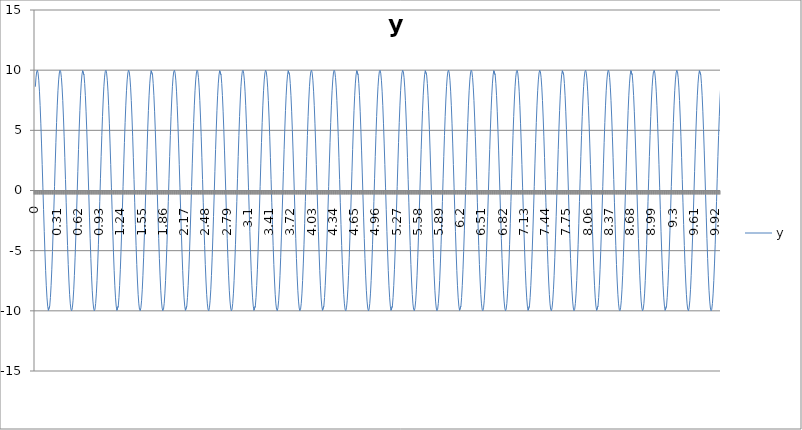
| Category | y |
|---|---|
| 0.0 | 8.623 |
| 0.01 | 9.419 |
| 0.02 | 9.882 |
| 0.03 | 9.994 |
| 0.04 | 9.752 |
| 0.05 | 9.165 |
| 0.060000000000000005 | 8.253 |
| 0.07 | 7.049 |
| 0.08 | 5.595 |
| 0.09 | 3.943 |
| 0.09999999999999999 | 2.151 |
| 0.10999999999999999 | 0.283 |
| 0.11999999999999998 | -1.595 |
| 0.12999999999999998 | -3.417 |
| 0.13999999999999999 | -5.117 |
| 0.15 | -6.636 |
| 0.16 | -7.921 |
| 0.17 | -8.924 |
| 0.18000000000000002 | -9.612 |
| 0.19000000000000003 | -9.958 |
| 0.20000000000000004 | -9.953 |
| 0.21000000000000005 | -9.594 |
| 0.22000000000000006 | -8.896 |
| 0.23000000000000007 | -7.882 |
| 0.24000000000000007 | -6.59 |
| 0.25000000000000006 | -5.064 |
| 0.26000000000000006 | -3.358 |
| 0.2700000000000001 | -1.534 |
| 0.2800000000000001 | 0.345 |
| 0.2900000000000001 | 2.212 |
| 0.3000000000000001 | 4 |
| 0.3100000000000001 | 5.646 |
| 0.3200000000000001 | 7.093 |
| 0.3300000000000001 | 8.288 |
| 0.34000000000000014 | 9.19 |
| 0.35000000000000014 | 9.766 |
| 0.36000000000000015 | 9.996 |
| 0.37000000000000016 | 9.872 |
| 0.38000000000000017 | 9.398 |
| 0.3900000000000002 | 8.592 |
| 0.4000000000000002 | 7.481 |
| 0.4100000000000002 | 6.105 |
| 0.4200000000000002 | 4.512 |
| 0.4300000000000002 | 2.76 |
| 0.4400000000000002 | 0.91 |
| 0.45000000000000023 | -0.972 |
| 0.46000000000000024 | -2.82 |
| 0.47000000000000025 | -4.568 |
| 0.48000000000000026 | -6.154 |
| 0.49000000000000027 | -7.522 |
| 0.5000000000000002 | -8.623 |
| 0.5100000000000002 | -9.419 |
| 0.5200000000000002 | -9.882 |
| 0.5300000000000002 | -9.994 |
| 0.5400000000000003 | -9.752 |
| 0.5500000000000003 | -9.165 |
| 0.5600000000000003 | -8.253 |
| 0.5700000000000003 | -7.049 |
| 0.5800000000000003 | -5.595 |
| 0.5900000000000003 | -3.943 |
| 0.6000000000000003 | -2.151 |
| 0.6100000000000003 | -0.283 |
| 0.6200000000000003 | 1.595 |
| 0.6300000000000003 | 3.417 |
| 0.6400000000000003 | 5.117 |
| 0.6500000000000004 | 6.636 |
| 0.6600000000000004 | 7.921 |
| 0.6700000000000004 | 8.924 |
| 0.6800000000000004 | 9.612 |
| 0.6900000000000004 | 9.958 |
| 0.7000000000000004 | 9.953 |
| 0.7100000000000004 | 9.594 |
| 0.7200000000000004 | 8.896 |
| 0.7300000000000004 | 7.882 |
| 0.7400000000000004 | 6.59 |
| 0.7500000000000004 | 5.064 |
| 0.7600000000000005 | 3.358 |
| 0.7700000000000005 | 1.534 |
| 0.7800000000000005 | -0.345 |
| 0.7900000000000005 | -2.212 |
| 0.8000000000000005 | -4 |
| 0.8100000000000005 | -5.646 |
| 0.8200000000000005 | -7.093 |
| 0.8300000000000005 | -8.288 |
| 0.8400000000000005 | -9.19 |
| 0.8500000000000005 | -9.766 |
| 0.8600000000000005 | -9.996 |
| 0.8700000000000006 | -9.872 |
| 0.8800000000000006 | -9.398 |
| 0.8900000000000006 | -8.592 |
| 0.9000000000000006 | -7.481 |
| 0.9100000000000006 | -6.105 |
| 0.9200000000000006 | -4.512 |
| 0.9300000000000006 | -2.76 |
| 0.9400000000000006 | -0.91 |
| 0.9500000000000006 | 0.972 |
| 0.9600000000000006 | 2.82 |
| 0.9700000000000006 | 4.568 |
| 0.9800000000000006 | 6.154 |
| 0.9900000000000007 | 7.522 |
| 1.0000000000000007 | 8.623 |
| 1.0100000000000007 | 9.419 |
| 1.0200000000000007 | 9.882 |
| 1.0300000000000007 | 9.994 |
| 1.0400000000000007 | 9.752 |
| 1.0500000000000007 | 9.165 |
| 1.0600000000000007 | 8.253 |
| 1.0700000000000007 | 7.049 |
| 1.0800000000000007 | 5.595 |
| 1.0900000000000007 | 3.943 |
| 1.1000000000000008 | 2.151 |
| 1.1100000000000008 | 0.283 |
| 1.1200000000000008 | -1.595 |
| 1.1300000000000008 | -3.417 |
| 1.1400000000000008 | -5.117 |
| 1.1500000000000008 | -6.636 |
| 1.1600000000000008 | -7.921 |
| 1.1700000000000008 | -8.924 |
| 1.1800000000000008 | -9.612 |
| 1.1900000000000008 | -9.958 |
| 1.2000000000000008 | -9.953 |
| 1.2100000000000009 | -9.594 |
| 1.2200000000000009 | -8.896 |
| 1.2300000000000009 | -7.882 |
| 1.2400000000000009 | -6.59 |
| 1.2500000000000009 | -5.064 |
| 1.260000000000001 | -3.358 |
| 1.270000000000001 | -1.534 |
| 1.280000000000001 | 0.345 |
| 1.290000000000001 | 2.212 |
| 1.300000000000001 | 4 |
| 1.310000000000001 | 5.646 |
| 1.320000000000001 | 7.093 |
| 1.330000000000001 | 8.288 |
| 1.340000000000001 | 9.19 |
| 1.350000000000001 | 9.766 |
| 1.360000000000001 | 9.996 |
| 1.370000000000001 | 9.872 |
| 1.380000000000001 | 9.398 |
| 1.390000000000001 | 8.592 |
| 1.400000000000001 | 7.481 |
| 1.410000000000001 | 6.105 |
| 1.420000000000001 | 4.512 |
| 1.430000000000001 | 2.76 |
| 1.440000000000001 | 0.91 |
| 1.450000000000001 | -0.972 |
| 1.460000000000001 | -2.82 |
| 1.470000000000001 | -4.568 |
| 1.480000000000001 | -6.154 |
| 1.490000000000001 | -7.522 |
| 1.500000000000001 | -8.623 |
| 1.5100000000000011 | -9.419 |
| 1.5200000000000011 | -9.882 |
| 1.5300000000000011 | -9.994 |
| 1.5400000000000011 | -9.752 |
| 1.5500000000000012 | -9.165 |
| 1.5600000000000012 | -8.253 |
| 1.5700000000000012 | -7.049 |
| 1.5800000000000012 | -5.595 |
| 1.5900000000000012 | -3.943 |
| 1.6000000000000012 | -2.151 |
| 1.6100000000000012 | -0.283 |
| 1.6200000000000012 | 1.595 |
| 1.6300000000000012 | 3.417 |
| 1.6400000000000012 | 5.117 |
| 1.6500000000000012 | 6.636 |
| 1.6600000000000013 | 7.921 |
| 1.6700000000000013 | 8.924 |
| 1.6800000000000013 | 9.612 |
| 1.6900000000000013 | 9.958 |
| 1.7000000000000013 | 9.953 |
| 1.7100000000000013 | 9.594 |
| 1.7200000000000013 | 8.896 |
| 1.7300000000000013 | 7.882 |
| 1.7400000000000013 | 6.59 |
| 1.7500000000000013 | 5.064 |
| 1.7600000000000013 | 3.358 |
| 1.7700000000000014 | 1.534 |
| 1.7800000000000014 | -0.345 |
| 1.7900000000000014 | -2.212 |
| 1.8000000000000014 | -4 |
| 1.8100000000000014 | -5.646 |
| 1.8200000000000014 | -7.093 |
| 1.8300000000000014 | -8.288 |
| 1.8400000000000014 | -9.19 |
| 1.8500000000000014 | -9.766 |
| 1.8600000000000014 | -9.996 |
| 1.8700000000000014 | -9.872 |
| 1.8800000000000014 | -9.398 |
| 1.8900000000000015 | -8.592 |
| 1.9000000000000015 | -7.481 |
| 1.9100000000000015 | -6.105 |
| 1.9200000000000015 | -4.512 |
| 1.9300000000000015 | -2.76 |
| 1.9400000000000015 | -0.91 |
| 1.9500000000000015 | 0.972 |
| 1.9600000000000015 | 2.82 |
| 1.9700000000000015 | 4.568 |
| 1.9800000000000015 | 6.154 |
| 1.9900000000000015 | 7.522 |
| 2.0000000000000013 | 8.623 |
| 2.010000000000001 | 9.419 |
| 2.020000000000001 | 9.882 |
| 2.0300000000000007 | 9.994 |
| 2.0400000000000005 | 9.752 |
| 2.0500000000000003 | 9.165 |
| 2.06 | 8.253 |
| 2.07 | 7.049 |
| 2.0799999999999996 | 5.595 |
| 2.0899999999999994 | 3.943 |
| 2.099999999999999 | 2.151 |
| 2.109999999999999 | 0.283 |
| 2.1199999999999988 | -1.595 |
| 2.1299999999999986 | -3.417 |
| 2.1399999999999983 | -5.117 |
| 2.149999999999998 | -6.636 |
| 2.159999999999998 | -7.921 |
| 2.1699999999999977 | -8.924 |
| 2.1799999999999975 | -9.612 |
| 2.1899999999999973 | -9.958 |
| 2.199999999999997 | -9.953 |
| 2.209999999999997 | -9.594 |
| 2.2199999999999966 | -8.896 |
| 2.2299999999999964 | -7.882 |
| 2.239999999999996 | -6.59 |
| 2.249999999999996 | -5.064 |
| 2.259999999999996 | -3.358 |
| 2.2699999999999956 | -1.534 |
| 2.2799999999999954 | 0.345 |
| 2.289999999999995 | 2.212 |
| 2.299999999999995 | 4 |
| 2.3099999999999947 | 5.646 |
| 2.3199999999999945 | 7.093 |
| 2.3299999999999943 | 8.288 |
| 2.339999999999994 | 9.19 |
| 2.349999999999994 | 9.766 |
| 2.3599999999999937 | 9.996 |
| 2.3699999999999934 | 9.872 |
| 2.3799999999999932 | 9.398 |
| 2.389999999999993 | 8.592 |
| 2.399999999999993 | 7.481 |
| 2.4099999999999926 | 6.105 |
| 2.4199999999999924 | 4.512 |
| 2.429999999999992 | 2.76 |
| 2.439999999999992 | 0.91 |
| 2.4499999999999917 | -0.972 |
| 2.4599999999999915 | -2.82 |
| 2.4699999999999913 | -4.568 |
| 2.479999999999991 | -6.154 |
| 2.489999999999991 | -7.522 |
| 2.4999999999999907 | -8.623 |
| 2.5099999999999905 | -9.419 |
| 2.5199999999999902 | -9.882 |
| 2.52999999999999 | -9.994 |
| 2.53999999999999 | -9.752 |
| 2.5499999999999896 | -9.165 |
| 2.5599999999999894 | -8.253 |
| 2.569999999999989 | -7.049 |
| 2.579999999999989 | -5.595 |
| 2.5899999999999888 | -3.943 |
| 2.5999999999999885 | -2.151 |
| 2.6099999999999883 | -0.283 |
| 2.619999999999988 | 1.595 |
| 2.629999999999988 | 3.417 |
| 2.6399999999999877 | 5.117 |
| 2.6499999999999875 | 6.636 |
| 2.6599999999999873 | 7.921 |
| 2.669999999999987 | 8.924 |
| 2.679999999999987 | 9.612 |
| 2.6899999999999866 | 9.958 |
| 2.6999999999999864 | 9.953 |
| 2.709999999999986 | 9.594 |
| 2.719999999999986 | 8.896 |
| 2.7299999999999858 | 7.882 |
| 2.7399999999999856 | 6.59 |
| 2.7499999999999853 | 5.064 |
| 2.759999999999985 | 3.358 |
| 2.769999999999985 | 1.534 |
| 2.7799999999999847 | -0.345 |
| 2.7899999999999845 | -2.212 |
| 2.7999999999999843 | -4 |
| 2.809999999999984 | -5.646 |
| 2.819999999999984 | -7.093 |
| 2.8299999999999836 | -8.288 |
| 2.8399999999999834 | -9.19 |
| 2.849999999999983 | -9.766 |
| 2.859999999999983 | -9.996 |
| 2.869999999999983 | -9.872 |
| 2.8799999999999826 | -9.398 |
| 2.8899999999999824 | -8.592 |
| 2.899999999999982 | -7.481 |
| 2.909999999999982 | -6.105 |
| 2.9199999999999817 | -4.512 |
| 2.9299999999999815 | -2.76 |
| 2.9399999999999813 | -0.91 |
| 2.949999999999981 | 0.972 |
| 2.959999999999981 | 2.82 |
| 2.9699999999999807 | 4.568 |
| 2.9799999999999804 | 6.154 |
| 2.9899999999999802 | 7.522 |
| 2.99999999999998 | 8.623 |
| 3.00999999999998 | 9.419 |
| 3.0199999999999796 | 9.882 |
| 3.0299999999999794 | 9.994 |
| 3.039999999999979 | 9.752 |
| 3.049999999999979 | 9.165 |
| 3.0599999999999787 | 8.253 |
| 3.0699999999999785 | 7.049 |
| 3.0799999999999783 | 5.595 |
| 3.089999999999978 | 3.943 |
| 3.099999999999978 | 2.151 |
| 3.1099999999999777 | 0.283 |
| 3.1199999999999775 | -1.595 |
| 3.1299999999999772 | -3.417 |
| 3.139999999999977 | -5.117 |
| 3.149999999999977 | -6.636 |
| 3.1599999999999766 | -7.921 |
| 3.1699999999999764 | -8.924 |
| 3.179999999999976 | -9.612 |
| 3.189999999999976 | -9.958 |
| 3.1999999999999758 | -9.953 |
| 3.2099999999999755 | -9.594 |
| 3.2199999999999753 | -8.896 |
| 3.229999999999975 | -7.882 |
| 3.239999999999975 | -6.59 |
| 3.2499999999999747 | -5.064 |
| 3.2599999999999745 | -3.358 |
| 3.2699999999999743 | -1.534 |
| 3.279999999999974 | 0.345 |
| 3.289999999999974 | 2.212 |
| 3.2999999999999736 | 4 |
| 3.3099999999999734 | 5.646 |
| 3.319999999999973 | 7.093 |
| 3.329999999999973 | 8.288 |
| 3.3399999999999728 | 9.19 |
| 3.3499999999999726 | 9.766 |
| 3.3599999999999723 | 9.996 |
| 3.369999999999972 | 9.872 |
| 3.379999999999972 | 9.398 |
| 3.3899999999999717 | 8.592 |
| 3.3999999999999715 | 7.481 |
| 3.4099999999999713 | 6.105 |
| 3.419999999999971 | 4.512 |
| 3.429999999999971 | 2.76 |
| 3.4399999999999706 | 0.91 |
| 3.4499999999999704 | -0.972 |
| 3.45999999999997 | -2.82 |
| 3.46999999999997 | -4.568 |
| 3.47999999999997 | -6.154 |
| 3.4899999999999696 | -7.522 |
| 3.4999999999999694 | -8.623 |
| 3.509999999999969 | -9.419 |
| 3.519999999999969 | -9.882 |
| 3.5299999999999687 | -9.994 |
| 3.5399999999999685 | -9.752 |
| 3.5499999999999683 | -9.165 |
| 3.559999999999968 | -8.253 |
| 3.569999999999968 | -7.049 |
| 3.5799999999999677 | -5.595 |
| 3.5899999999999674 | -3.943 |
| 3.5999999999999672 | -2.151 |
| 3.609999999999967 | -0.283 |
| 3.619999999999967 | 1.595 |
| 3.6299999999999666 | 3.417 |
| 3.6399999999999664 | 5.117 |
| 3.649999999999966 | 6.636 |
| 3.659999999999966 | 7.921 |
| 3.6699999999999657 | 8.924 |
| 3.6799999999999655 | 9.612 |
| 3.6899999999999653 | 9.958 |
| 3.699999999999965 | 9.953 |
| 3.709999999999965 | 9.594 |
| 3.7199999999999647 | 8.896 |
| 3.7299999999999645 | 7.882 |
| 3.7399999999999642 | 6.59 |
| 3.749999999999964 | 5.064 |
| 3.759999999999964 | 3.358 |
| 3.7699999999999636 | 1.534 |
| 3.7799999999999634 | -0.345 |
| 3.789999999999963 | -2.212 |
| 3.799999999999963 | -4 |
| 3.8099999999999627 | -5.646 |
| 3.8199999999999625 | -7.093 |
| 3.8299999999999623 | -8.288 |
| 3.839999999999962 | -9.19 |
| 3.849999999999962 | -9.766 |
| 3.8599999999999617 | -9.996 |
| 3.8699999999999615 | -9.872 |
| 3.8799999999999613 | -9.398 |
| 3.889999999999961 | -8.592 |
| 3.899999999999961 | -7.481 |
| 3.9099999999999606 | -6.105 |
| 3.9199999999999604 | -4.512 |
| 3.92999999999996 | -2.76 |
| 3.93999999999996 | -0.91 |
| 3.9499999999999598 | 0.972 |
| 3.9599999999999596 | 2.82 |
| 3.9699999999999593 | 4.568 |
| 3.979999999999959 | 6.154 |
| 3.989999999999959 | 7.522 |
| 3.9999999999999587 | 8.623 |
| 4.009999999999959 | 9.419 |
| 4.019999999999959 | 9.882 |
| 4.0299999999999585 | 9.994 |
| 4.039999999999958 | 9.752 |
| 4.049999999999958 | 9.165 |
| 4.059999999999958 | 8.253 |
| 4.069999999999958 | 7.049 |
| 4.079999999999957 | 5.595 |
| 4.089999999999957 | 3.943 |
| 4.099999999999957 | 2.151 |
| 4.109999999999957 | 0.283 |
| 4.119999999999957 | -1.595 |
| 4.129999999999956 | -3.417 |
| 4.139999999999956 | -5.117 |
| 4.149999999999956 | -6.636 |
| 4.159999999999956 | -7.921 |
| 4.1699999999999555 | -8.924 |
| 4.179999999999955 | -9.612 |
| 4.189999999999955 | -9.958 |
| 4.199999999999955 | -9.953 |
| 4.209999999999955 | -9.594 |
| 4.2199999999999545 | -8.896 |
| 4.229999999999954 | -7.882 |
| 4.239999999999954 | -6.59 |
| 4.249999999999954 | -5.064 |
| 4.259999999999954 | -3.358 |
| 4.269999999999953 | -1.534 |
| 4.279999999999953 | 0.345 |
| 4.289999999999953 | 2.212 |
| 4.299999999999953 | 4 |
| 4.3099999999999525 | 5.646 |
| 4.319999999999952 | 7.093 |
| 4.329999999999952 | 8.288 |
| 4.339999999999952 | 9.19 |
| 4.349999999999952 | 9.766 |
| 4.3599999999999515 | 9.996 |
| 4.369999999999951 | 9.872 |
| 4.379999999999951 | 9.398 |
| 4.389999999999951 | 8.592 |
| 4.399999999999951 | 7.481 |
| 4.40999999999995 | 6.105 |
| 4.41999999999995 | 4.512 |
| 4.42999999999995 | 2.76 |
| 4.43999999999995 | 0.91 |
| 4.4499999999999496 | -0.972 |
| 4.459999999999949 | -2.82 |
| 4.469999999999949 | -4.568 |
| 4.479999999999949 | -6.154 |
| 4.489999999999949 | -7.522 |
| 4.4999999999999485 | -8.623 |
| 4.509999999999948 | -9.419 |
| 4.519999999999948 | -9.882 |
| 4.529999999999948 | -9.994 |
| 4.539999999999948 | -9.752 |
| 4.549999999999947 | -9.165 |
| 4.559999999999947 | -8.253 |
| 4.569999999999947 | -7.049 |
| 4.579999999999947 | -5.595 |
| 4.589999999999947 | -3.943 |
| 4.599999999999946 | -2.151 |
| 4.609999999999946 | -0.283 |
| 4.619999999999946 | 1.595 |
| 4.629999999999946 | 3.417 |
| 4.6399999999999455 | 5.117 |
| 4.649999999999945 | 6.636 |
| 4.659999999999945 | 7.921 |
| 4.669999999999945 | 8.924 |
| 4.679999999999945 | 9.612 |
| 4.689999999999944 | 9.958 |
| 4.699999999999944 | 9.953 |
| 4.709999999999944 | 9.594 |
| 4.719999999999944 | 8.896 |
| 4.729999999999944 | 7.882 |
| 4.739999999999943 | 6.59 |
| 4.749999999999943 | 5.064 |
| 4.759999999999943 | 3.358 |
| 4.769999999999943 | 1.534 |
| 4.7799999999999425 | -0.345 |
| 4.789999999999942 | -2.212 |
| 4.799999999999942 | -4 |
| 4.809999999999942 | -5.646 |
| 4.819999999999942 | -7.093 |
| 4.8299999999999415 | -8.288 |
| 4.839999999999941 | -9.19 |
| 4.849999999999941 | -9.766 |
| 4.859999999999941 | -9.996 |
| 4.869999999999941 | -9.872 |
| 4.87999999999994 | -9.398 |
| 4.88999999999994 | -8.592 |
| 4.89999999999994 | -7.481 |
| 4.90999999999994 | -6.105 |
| 4.9199999999999395 | -4.512 |
| 4.929999999999939 | -2.76 |
| 4.939999999999939 | -0.91 |
| 4.949999999999939 | 0.972 |
| 4.959999999999939 | 2.82 |
| 4.9699999999999385 | 4.568 |
| 4.979999999999938 | 6.154 |
| 4.989999999999938 | 7.522 |
| 4.999999999999938 | 8.623 |
| 5.009999999999938 | 9.419 |
| 5.019999999999937 | 9.882 |
| 5.029999999999937 | 9.994 |
| 5.039999999999937 | 9.752 |
| 5.049999999999937 | 9.165 |
| 5.0599999999999365 | 8.253 |
| 5.069999999999936 | 7.049 |
| 5.079999999999936 | 5.595 |
| 5.089999999999936 | 3.943 |
| 5.099999999999936 | 2.151 |
| 5.1099999999999355 | 0.283 |
| 5.119999999999935 | -1.595 |
| 5.129999999999935 | -3.417 |
| 5.139999999999935 | -5.117 |
| 5.149999999999935 | -6.636 |
| 5.159999999999934 | -7.921 |
| 5.169999999999934 | -8.924 |
| 5.179999999999934 | -9.612 |
| 5.189999999999934 | -9.958 |
| 5.199999999999934 | -9.953 |
| 5.209999999999933 | -9.594 |
| 5.219999999999933 | -8.896 |
| 5.229999999999933 | -7.882 |
| 5.239999999999933 | -6.59 |
| 5.2499999999999325 | -5.064 |
| 5.259999999999932 | -3.358 |
| 5.269999999999932 | -1.534 |
| 5.279999999999932 | 0.345 |
| 5.289999999999932 | 2.212 |
| 5.299999999999931 | 4 |
| 5.309999999999931 | 5.646 |
| 5.319999999999931 | 7.093 |
| 5.329999999999931 | 8.288 |
| 5.339999999999931 | 9.19 |
| 5.34999999999993 | 9.766 |
| 5.35999999999993 | 9.996 |
| 5.36999999999993 | 9.872 |
| 5.37999999999993 | 9.398 |
| 5.3899999999999295 | 8.592 |
| 5.399999999999929 | 7.481 |
| 5.409999999999929 | 6.105 |
| 5.419999999999929 | 4.512 |
| 5.429999999999929 | 2.76 |
| 5.4399999999999284 | 0.91 |
| 5.449999999999928 | -0.972 |
| 5.459999999999928 | -2.82 |
| 5.469999999999928 | -4.568 |
| 5.479999999999928 | -6.154 |
| 5.489999999999927 | -7.522 |
| 5.499999999999927 | -8.623 |
| 5.509999999999927 | -9.419 |
| 5.519999999999927 | -9.882 |
| 5.5299999999999265 | -9.994 |
| 5.539999999999926 | -9.752 |
| 5.549999999999926 | -9.165 |
| 5.559999999999926 | -8.253 |
| 5.569999999999926 | -7.049 |
| 5.5799999999999255 | -5.595 |
| 5.589999999999925 | -3.943 |
| 5.599999999999925 | -2.151 |
| 5.609999999999925 | -0.283 |
| 5.619999999999925 | 1.595 |
| 5.629999999999924 | 3.417 |
| 5.639999999999924 | 5.117 |
| 5.649999999999924 | 6.636 |
| 5.659999999999924 | 7.921 |
| 5.6699999999999235 | 8.924 |
| 5.679999999999923 | 9.612 |
| 5.689999999999923 | 9.958 |
| 5.699999999999923 | 9.953 |
| 5.709999999999923 | 9.594 |
| 5.7199999999999225 | 8.896 |
| 5.729999999999922 | 7.882 |
| 5.739999999999922 | 6.59 |
| 5.749999999999922 | 5.064 |
| 5.759999999999922 | 3.358 |
| 5.769999999999921 | 1.534 |
| 5.779999999999921 | -0.345 |
| 5.789999999999921 | -2.212 |
| 5.799999999999921 | -4 |
| 5.809999999999921 | -5.646 |
| 5.81999999999992 | -7.093 |
| 5.82999999999992 | -8.288 |
| 5.83999999999992 | -9.19 |
| 5.84999999999992 | -9.766 |
| 5.8599999999999195 | -9.996 |
| 5.869999999999919 | -9.872 |
| 5.879999999999919 | -9.398 |
| 5.889999999999919 | -8.592 |
| 5.899999999999919 | -7.481 |
| 5.909999999999918 | -6.105 |
| 5.919999999999918 | -4.512 |
| 5.929999999999918 | -2.76 |
| 5.939999999999918 | -0.91 |
| 5.949999999999918 | 0.972 |
| 5.959999999999917 | 2.82 |
| 5.969999999999917 | 4.568 |
| 5.979999999999917 | 6.154 |
| 5.989999999999917 | 7.522 |
| 5.9999999999999165 | 8.623 |
| 6.009999999999916 | 9.419 |
| 6.019999999999916 | 9.882 |
| 6.029999999999916 | 9.994 |
| 6.039999999999916 | 9.752 |
| 6.0499999999999154 | 9.165 |
| 6.059999999999915 | 8.253 |
| 6.069999999999915 | 7.049 |
| 6.079999999999915 | 5.595 |
| 6.089999999999915 | 3.943 |
| 6.099999999999914 | 2.151 |
| 6.109999999999914 | 0.283 |
| 6.119999999999914 | -1.595 |
| 6.129999999999914 | -3.417 |
| 6.1399999999999135 | -5.117 |
| 6.149999999999913 | -6.636 |
| 6.159999999999913 | -7.921 |
| 6.169999999999913 | -8.924 |
| 6.179999999999913 | -9.612 |
| 6.1899999999999125 | -9.958 |
| 6.199999999999912 | -9.953 |
| 6.209999999999912 | -9.594 |
| 6.219999999999912 | -8.896 |
| 6.229999999999912 | -7.882 |
| 6.239999999999911 | -6.59 |
| 6.249999999999911 | -5.064 |
| 6.259999999999911 | -3.358 |
| 6.269999999999911 | -1.534 |
| 6.2799999999999105 | 0.345 |
| 6.28999999999991 | 2.212 |
| 6.29999999999991 | 4 |
| 6.30999999999991 | 5.646 |
| 6.31999999999991 | 7.093 |
| 6.3299999999999095 | 8.288 |
| 6.339999999999909 | 9.19 |
| 6.349999999999909 | 9.766 |
| 6.359999999999909 | 9.996 |
| 6.369999999999909 | 9.872 |
| 6.379999999999908 | 9.398 |
| 6.389999999999908 | 8.592 |
| 6.399999999999908 | 7.481 |
| 6.409999999999908 | 6.105 |
| 6.419999999999908 | 4.512 |
| 6.429999999999907 | 2.76 |
| 6.439999999999907 | 0.91 |
| 6.449999999999907 | -0.972 |
| 6.459999999999907 | -2.82 |
| 6.4699999999999065 | -4.568 |
| 6.479999999999906 | -6.154 |
| 6.489999999999906 | -7.522 |
| 6.499999999999906 | -8.623 |
| 6.509999999999906 | -9.419 |
| 6.519999999999905 | -9.882 |
| 6.529999999999905 | -9.994 |
| 6.539999999999905 | -9.752 |
| 6.549999999999905 | -9.165 |
| 6.559999999999905 | -8.253 |
| 6.569999999999904 | -7.049 |
| 6.579999999999904 | -5.595 |
| 6.589999999999904 | -3.943 |
| 6.599999999999904 | -2.151 |
| 6.6099999999999035 | -0.283 |
| 6.619999999999903 | 1.595 |
| 6.629999999999903 | 3.417 |
| 6.639999999999903 | 5.117 |
| 6.649999999999903 | 6.636 |
| 6.659999999999902 | 7.921 |
| 6.669999999999902 | 8.924 |
| 6.679999999999902 | 9.612 |
| 6.689999999999902 | 9.958 |
| 6.699999999999902 | 9.953 |
| 6.709999999999901 | 9.594 |
| 6.719999999999901 | 8.896 |
| 6.729999999999901 | 7.882 |
| 6.739999999999901 | 6.59 |
| 6.7499999999999005 | 5.064 |
| 6.7599999999999 | 3.358 |
| 6.7699999999999 | 1.534 |
| 6.7799999999999 | -0.345 |
| 6.7899999999999 | -2.212 |
| 6.7999999999998995 | -4 |
| 6.809999999999899 | -5.646 |
| 6.819999999999899 | -7.093 |
| 6.829999999999899 | -8.288 |
| 6.839999999999899 | -9.19 |
| 6.849999999999898 | -9.766 |
| 6.859999999999898 | -9.996 |
| 6.869999999999898 | -9.872 |
| 6.879999999999898 | -9.398 |
| 6.8899999999998975 | -8.592 |
| 6.899999999999897 | -7.481 |
| 6.909999999999897 | -6.105 |
| 6.919999999999897 | -4.512 |
| 6.929999999999897 | -2.76 |
| 6.9399999999998965 | -0.91 |
| 6.949999999999896 | 0.972 |
| 6.959999999999896 | 2.82 |
| 6.969999999999896 | 4.568 |
| 6.979999999999896 | 6.154 |
| 6.989999999999895 | 7.522 |
| 6.999999999999895 | 8.623 |
| 7.009999999999895 | 9.419 |
| 7.019999999999895 | 9.882 |
| 7.0299999999998946 | 9.994 |
| 7.039999999999894 | 9.752 |
| 7.049999999999894 | 9.165 |
| 7.059999999999894 | 8.253 |
| 7.069999999999894 | 7.049 |
| 7.0799999999998935 | 5.595 |
| 7.089999999999893 | 3.943 |
| 7.099999999999893 | 2.151 |
| 7.109999999999893 | 0.283 |
| 7.119999999999893 | -1.595 |
| 7.129999999999892 | -3.417 |
| 7.139999999999892 | -5.117 |
| 7.149999999999892 | -6.636 |
| 7.159999999999892 | -7.921 |
| 7.169999999999892 | -8.924 |
| 7.179999999999891 | -9.612 |
| 7.189999999999891 | -9.958 |
| 7.199999999999891 | -9.953 |
| 7.209999999999891 | -9.594 |
| 7.2199999999998905 | -8.896 |
| 7.22999999999989 | -7.882 |
| 7.23999999999989 | -6.59 |
| 7.24999999999989 | -5.064 |
| 7.25999999999989 | -3.358 |
| 7.269999999999889 | -1.534 |
| 7.279999999999889 | 0.345 |
| 7.289999999999889 | 2.212 |
| 7.299999999999889 | 4 |
| 7.309999999999889 | 5.646 |
| 7.319999999999888 | 7.093 |
| 7.329999999999888 | 8.288 |
| 7.339999999999888 | 9.19 |
| 7.349999999999888 | 9.766 |
| 7.3599999999998875 | 9.996 |
| 7.369999999999887 | 9.872 |
| 7.379999999999887 | 9.398 |
| 7.389999999999887 | 8.592 |
| 7.399999999999887 | 7.481 |
| 7.4099999999998865 | 6.105 |
| 7.419999999999886 | 4.512 |
| 7.429999999999886 | 2.76 |
| 7.439999999999886 | 0.91 |
| 7.449999999999886 | -0.972 |
| 7.459999999999885 | -2.82 |
| 7.469999999999885 | -4.568 |
| 7.479999999999885 | -6.154 |
| 7.489999999999885 | -7.522 |
| 7.4999999999998845 | -8.623 |
| 7.509999999999884 | -9.419 |
| 7.519999999999884 | -9.882 |
| 7.529999999999884 | -9.994 |
| 7.539999999999884 | -9.752 |
| 7.5499999999998835 | -9.165 |
| 7.559999999999883 | -8.253 |
| 7.569999999999883 | -7.049 |
| 7.579999999999883 | -5.595 |
| 7.589999999999883 | -3.943 |
| 7.599999999999882 | -2.151 |
| 7.609999999999882 | -0.283 |
| 7.619999999999882 | 1.595 |
| 7.629999999999882 | 3.417 |
| 7.6399999999998816 | 5.117 |
| 7.649999999999881 | 6.636 |
| 7.659999999999881 | 7.921 |
| 7.669999999999881 | 8.924 |
| 7.679999999999881 | 9.612 |
| 7.6899999999998805 | 9.958 |
| 7.69999999999988 | 9.953 |
| 7.70999999999988 | 9.594 |
| 7.71999999999988 | 8.896 |
| 7.72999999999988 | 7.882 |
| 7.739999999999879 | 6.59 |
| 7.749999999999879 | 5.064 |
| 7.759999999999879 | 3.358 |
| 7.769999999999879 | 1.534 |
| 7.779999999999879 | -0.345 |
| 7.789999999999878 | -2.212 |
| 7.799999999999878 | -4 |
| 7.809999999999878 | -5.646 |
| 7.819999999999878 | -7.093 |
| 7.8299999999998775 | -8.288 |
| 7.839999999999877 | -9.19 |
| 7.849999999999877 | -9.766 |
| 7.859999999999877 | -9.996 |
| 7.869999999999877 | -9.872 |
| 7.879999999999876 | -9.398 |
| 7.889999999999876 | -8.592 |
| 7.899999999999876 | -7.481 |
| 7.909999999999876 | -6.105 |
| 7.919999999999876 | -4.512 |
| 7.929999999999875 | -2.76 |
| 7.939999999999875 | -0.91 |
| 7.949999999999875 | 0.972 |
| 7.959999999999875 | 2.82 |
| 7.9699999999998745 | 4.568 |
| 7.979999999999874 | 6.154 |
| 7.989999999999874 | 7.522 |
| 7.999999999999874 | 8.623 |
| 8.009999999999874 | 9.419 |
| 8.019999999999873 | 9.882 |
| 8.029999999999873 | 9.994 |
| 8.039999999999873 | 9.752 |
| 8.049999999999873 | 9.165 |
| 8.059999999999873 | 8.253 |
| 8.069999999999872 | 7.049 |
| 8.079999999999872 | 5.595 |
| 8.089999999999872 | 3.943 |
| 8.099999999999872 | 2.151 |
| 8.109999999999872 | 0.283 |
| 8.119999999999871 | -1.595 |
| 8.129999999999871 | -3.417 |
| 8.139999999999871 | -5.117 |
| 8.14999999999987 | -6.636 |
| 8.15999999999987 | -7.921 |
| 8.16999999999987 | -8.924 |
| 8.17999999999987 | -9.612 |
| 8.18999999999987 | -9.958 |
| 8.19999999999987 | -9.953 |
| 8.20999999999987 | -9.594 |
| 8.21999999999987 | -8.896 |
| 8.229999999999869 | -7.882 |
| 8.239999999999869 | -6.59 |
| 8.249999999999869 | -5.064 |
| 8.259999999999868 | -3.358 |
| 8.269999999999868 | -1.534 |
| 8.279999999999868 | 0.345 |
| 8.289999999999868 | 2.212 |
| 8.299999999999867 | 4 |
| 8.309999999999867 | 5.646 |
| 8.319999999999867 | 7.093 |
| 8.329999999999867 | 8.288 |
| 8.339999999999867 | 9.19 |
| 8.349999999999866 | 9.766 |
| 8.359999999999866 | 9.996 |
| 8.369999999999866 | 9.872 |
| 8.379999999999866 | 9.398 |
| 8.389999999999866 | 8.592 |
| 8.399999999999865 | 7.481 |
| 8.409999999999865 | 6.105 |
| 8.419999999999865 | 4.512 |
| 8.429999999999865 | 2.76 |
| 8.439999999999864 | 0.91 |
| 8.449999999999864 | -0.972 |
| 8.459999999999864 | -2.82 |
| 8.469999999999864 | -4.568 |
| 8.479999999999864 | -6.154 |
| 8.489999999999863 | -7.522 |
| 8.499999999999863 | -8.623 |
| 8.509999999999863 | -9.419 |
| 8.519999999999863 | -9.882 |
| 8.529999999999863 | -9.994 |
| 8.539999999999862 | -9.752 |
| 8.549999999999862 | -9.165 |
| 8.559999999999862 | -8.253 |
| 8.569999999999862 | -7.049 |
| 8.579999999999862 | -5.595 |
| 8.589999999999861 | -3.943 |
| 8.599999999999861 | -2.151 |
| 8.60999999999986 | -0.283 |
| 8.61999999999986 | 1.595 |
| 8.62999999999986 | 3.417 |
| 8.63999999999986 | 5.117 |
| 8.64999999999986 | 6.636 |
| 8.65999999999986 | 7.921 |
| 8.66999999999986 | 8.924 |
| 8.67999999999986 | 9.612 |
| 8.68999999999986 | 9.958 |
| 8.699999999999859 | 9.953 |
| 8.709999999999859 | 9.594 |
| 8.719999999999859 | 8.896 |
| 8.729999999999858 | 7.882 |
| 8.739999999999858 | 6.59 |
| 8.749999999999858 | 5.064 |
| 8.759999999999858 | 3.358 |
| 8.769999999999857 | 1.534 |
| 8.779999999999857 | -0.345 |
| 8.789999999999857 | -2.212 |
| 8.799999999999857 | -4 |
| 8.809999999999857 | -5.646 |
| 8.819999999999856 | -7.093 |
| 8.829999999999856 | -8.288 |
| 8.839999999999856 | -9.19 |
| 8.849999999999856 | -9.766 |
| 8.859999999999856 | -9.996 |
| 8.869999999999855 | -9.872 |
| 8.879999999999855 | -9.398 |
| 8.889999999999855 | -8.592 |
| 8.899999999999855 | -7.481 |
| 8.909999999999854 | -6.105 |
| 8.919999999999854 | -4.512 |
| 8.929999999999854 | -2.76 |
| 8.939999999999854 | -0.91 |
| 8.949999999999854 | 0.972 |
| 8.959999999999853 | 2.82 |
| 8.969999999999853 | 4.568 |
| 8.979999999999853 | 6.154 |
| 8.989999999999853 | 7.522 |
| 8.999999999999853 | 8.623 |
| 9.009999999999852 | 9.419 |
| 9.019999999999852 | 9.882 |
| 9.029999999999852 | 9.994 |
| 9.039999999999852 | 9.752 |
| 9.049999999999851 | 9.165 |
| 9.059999999999851 | 8.253 |
| 9.069999999999851 | 7.049 |
| 9.07999999999985 | 5.595 |
| 9.08999999999985 | 3.943 |
| 9.09999999999985 | 2.151 |
| 9.10999999999985 | 0.283 |
| 9.11999999999985 | -1.595 |
| 9.12999999999985 | -3.417 |
| 9.13999999999985 | -5.117 |
| 9.14999999999985 | -6.636 |
| 9.15999999999985 | -7.921 |
| 9.169999999999849 | -8.924 |
| 9.179999999999849 | -9.612 |
| 9.189999999999849 | -9.958 |
| 9.199999999999848 | -9.953 |
| 9.209999999999848 | -9.594 |
| 9.219999999999848 | -8.896 |
| 9.229999999999848 | -7.882 |
| 9.239999999999847 | -6.59 |
| 9.249999999999847 | -5.064 |
| 9.259999999999847 | -3.358 |
| 9.269999999999847 | -1.534 |
| 9.279999999999847 | 0.345 |
| 9.289999999999846 | 2.212 |
| 9.299999999999846 | 4 |
| 9.309999999999846 | 5.646 |
| 9.319999999999846 | 7.093 |
| 9.329999999999846 | 8.288 |
| 9.339999999999845 | 9.19 |
| 9.349999999999845 | 9.766 |
| 9.359999999999845 | 9.996 |
| 9.369999999999845 | 9.872 |
| 9.379999999999844 | 9.398 |
| 9.389999999999844 | 8.592 |
| 9.399999999999844 | 7.481 |
| 9.409999999999844 | 6.105 |
| 9.419999999999844 | 4.512 |
| 9.429999999999843 | 2.76 |
| 9.439999999999843 | 0.91 |
| 9.449999999999843 | -0.972 |
| 9.459999999999843 | -2.82 |
| 9.469999999999843 | -4.568 |
| 9.479999999999842 | -6.154 |
| 9.489999999999842 | -7.522 |
| 9.499999999999842 | -8.623 |
| 9.509999999999842 | -9.419 |
| 9.519999999999841 | -9.882 |
| 9.529999999999841 | -9.994 |
| 9.539999999999841 | -9.752 |
| 9.54999999999984 | -9.165 |
| 9.55999999999984 | -8.253 |
| 9.56999999999984 | -7.049 |
| 9.57999999999984 | -5.595 |
| 9.58999999999984 | -3.943 |
| 9.59999999999984 | -2.151 |
| 9.60999999999984 | -0.283 |
| 9.61999999999984 | 1.595 |
| 9.62999999999984 | 3.417 |
| 9.639999999999839 | 5.117 |
| 9.649999999999839 | 6.636 |
| 9.659999999999838 | 7.921 |
| 9.669999999999838 | 8.924 |
| 9.679999999999838 | 9.612 |
| 9.689999999999838 | 9.958 |
| 9.699999999999838 | 9.953 |
| 9.709999999999837 | 9.594 |
| 9.719999999999837 | 8.896 |
| 9.729999999999837 | 7.882 |
| 9.739999999999837 | 6.59 |
| 9.749999999999837 | 5.064 |
| 9.759999999999836 | 3.358 |
| 9.769999999999836 | 1.534 |
| 9.779999999999836 | -0.345 |
| 9.789999999999836 | -2.212 |
| 9.799999999999836 | -4 |
| 9.809999999999835 | -5.646 |
| 9.819999999999835 | -7.093 |
| 9.829999999999835 | -8.288 |
| 9.839999999999835 | -9.19 |
| 9.849999999999834 | -9.766 |
| 9.859999999999834 | -9.996 |
| 9.869999999999834 | -9.872 |
| 9.879999999999834 | -9.398 |
| 9.889999999999834 | -8.592 |
| 9.899999999999833 | -7.481 |
| 9.909999999999833 | -6.105 |
| 9.919999999999833 | -4.512 |
| 9.929999999999833 | -2.76 |
| 9.939999999999833 | -0.91 |
| 9.949999999999832 | 0.972 |
| 9.959999999999832 | 2.82 |
| 9.969999999999832 | 4.568 |
| 9.979999999999832 | 6.154 |
| 9.989999999999831 | 7.522 |
| 9.999999999999831 | 8.623 |